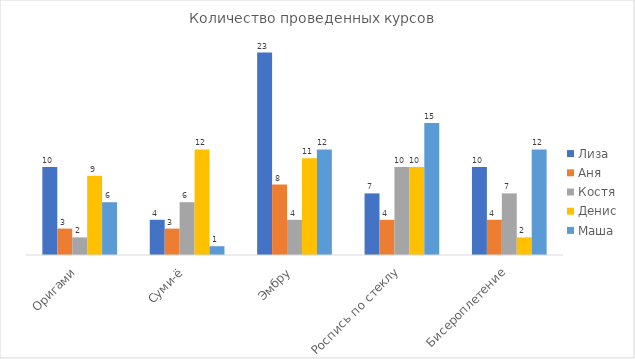
| Category | Лиза | Аня | Костя | Денис | Маша |
|---|---|---|---|---|---|
| Оригами | 10 | 3 | 2 | 9 | 6 |
| Суми-ё | 4 | 3 | 6 | 12 | 1 |
| Эмбру | 23 | 8 | 4 | 11 | 12 |
| Роспись по стеклу | 7 | 4 | 10 | 10 | 15 |
| Бисероплетение | 10 | 4 | 7 | 2 | 12 |